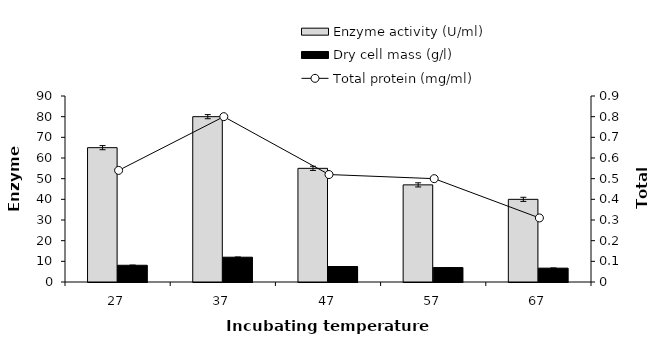
| Category | Enzyme activity (U/ml) | Dry cell mass (g/l) |
|---|---|---|
| 27.0 | 65 | 8.1 |
| 37.0 | 80 | 12 |
| 47.0 | 55 | 7.5 |
| 57.0 | 47 | 7 |
| 67.0 | 40 | 6.7 |